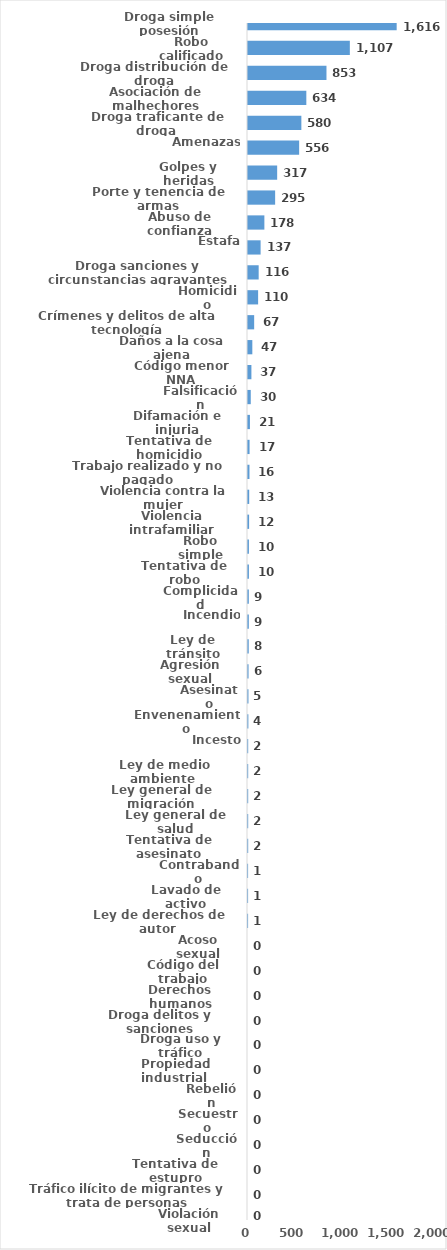
| Category | Series 0 |
|---|---|
| Droga simple posesión | 1616 |
| Robo calificado | 1107 |
| Droga distribución de droga | 853 |
| Asociación de malhechores | 634 |
| Droga traficante de droga  | 580 |
| Amenazas | 556 |
| Golpes y heridas | 317 |
| Porte y tenencia de armas | 295 |
| Abuso de confianza | 178 |
| Estafa | 137 |
| Droga sanciones y circunstancias agravantes | 116 |
| Homicidio | 110 |
| Crímenes y delitos de alta tecnología | 67 |
| Daños a la cosa ajena | 47 |
| Código menor NNA | 37 |
| Falsificación | 30 |
| Difamación e injuria | 21 |
| Tentativa de homicidio | 17 |
| Trabajo realizado y no pagado | 16 |
| Violencia contra la mujer | 13 |
| Violencia intrafamiliar | 12 |
| Robo simple | 10 |
| Tentativa de robo | 10 |
| Complicidad | 9 |
| Incendio | 9 |
| Ley de tránsito | 8 |
| Agresión sexual | 6 |
| Asesinato | 5 |
| Envenenamiento | 4 |
| Incesto | 2 |
| Ley de medio ambiente  | 2 |
| Ley general de migración | 2 |
| Ley general de salud | 2 |
| Tentativa de asesinato | 2 |
| Contrabando | 1 |
| Lavado de activo | 1 |
| Ley de derechos de autor  | 1 |
| Acoso sexual | 0 |
| Código del trabajo | 0 |
| Derechos humanos | 0 |
| Droga delitos y sanciones | 0 |
| Droga uso y tráfico | 0 |
| Propiedad industrial  | 0 |
| Rebelión | 0 |
| Secuestro | 0 |
| Seducción | 0 |
| Tentativa de estupro | 0 |
| Tráfico ilícito de migrantes y trata de personas | 0 |
| Violación sexual | 0 |